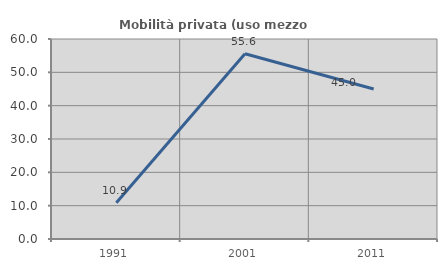
| Category | Mobilità privata (uso mezzo privato) |
|---|---|
| 1991.0 | 10.87 |
| 2001.0 | 55.556 |
| 2011.0 | 45 |